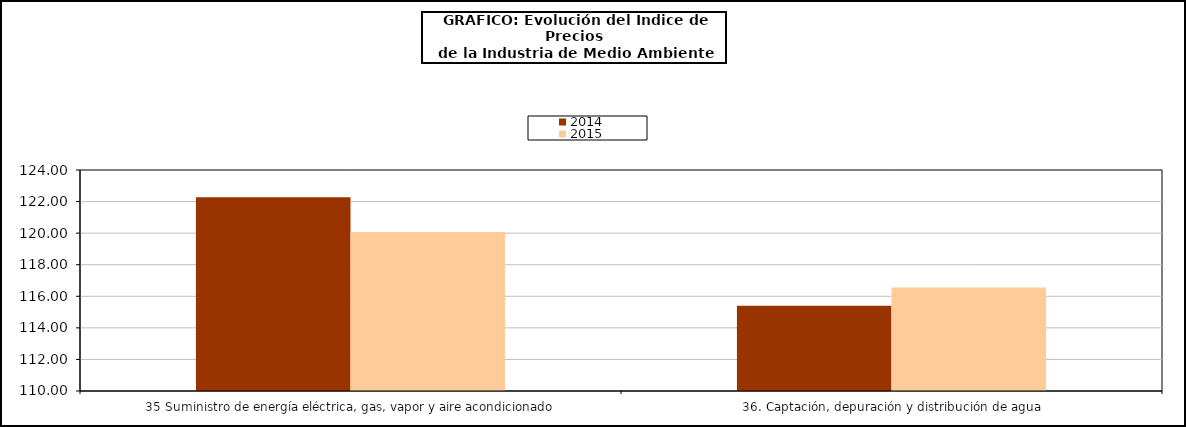
| Category | 2014 | 2015 |
|---|---|---|
| 35 Suministro de energía eléctrica, gas, vapor y aire acondicionado | 122.267 | 120.064 |
| 36. Captación, depuración y distribución de agua | 115.395 | 116.564 |